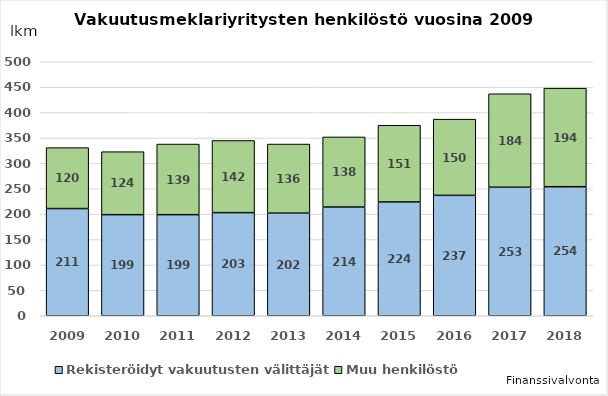
| Category | Rekisteröidyt vakuutusten välittäjät  | Muu henkilöstö |
|---|---|---|
| 2009.0 | 211 | 120 |
| 2010.0 | 199 | 124 |
| 2011.0 | 199 | 139 |
| 2012.0 | 203 | 142 |
| 2013.0 | 202 | 136 |
| 2014.0 | 214 | 138 |
| 2015.0 | 224 | 151 |
| 2016.0 | 237 | 150 |
| 2017.0 | 253 | 184 |
| 2018.0 | 254 | 194 |